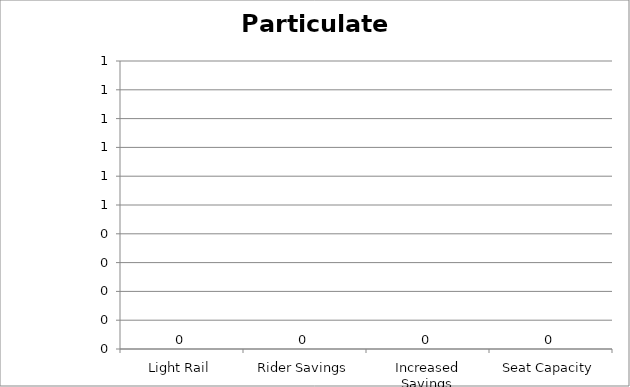
| Category | Particulate Matter |
|---|---|
| Light Rail | 0 |
| Rider Savings | 0 |
| Increased Savings | 0 |
| Seat Capacity | 0 |